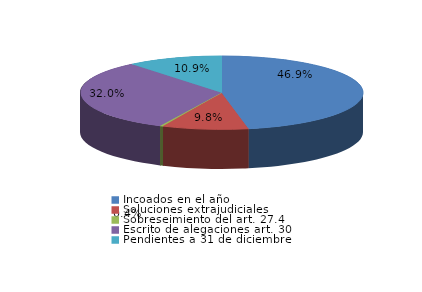
| Category | Series 0 |
|---|---|
| Incoados en el año | 392 |
| Soluciones extrajudiciales | 82 |
| Sobreseimiento del art. 27.4 | 3 |
| Escrito de alegaciones art. 30 | 267 |
| Pendientes a 31 de diciembre | 91 |